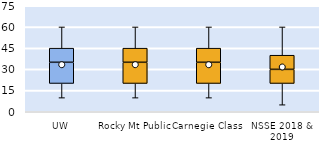
| Category | 25th | 50th | 75th |
|---|---|---|---|
| UW | 20 | 15 | 10 |
| Rocky Mt Public | 20 | 15 | 10 |
| Carnegie Class | 20 | 15 | 10 |
| NSSE 2018 & 2019 | 20 | 10 | 10 |